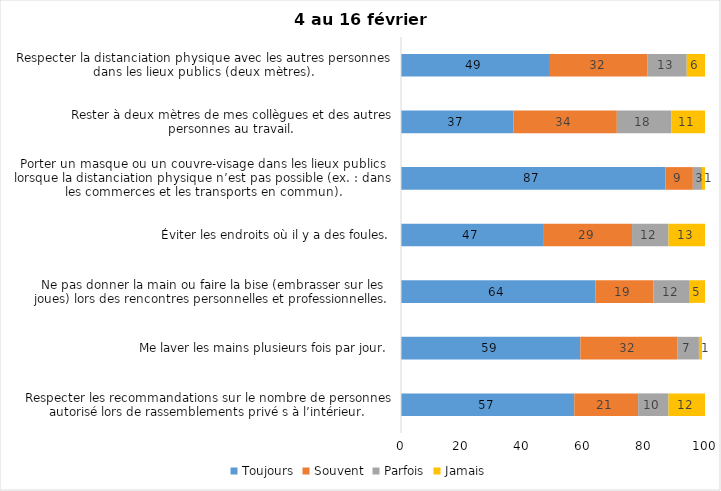
| Category | Toujours | Souvent | Parfois | Jamais |
|---|---|---|---|---|
| Respecter les recommandations sur le nombre de personnes autorisé lors de rassemblements privé s à l’intérieur. | 57 | 21 | 10 | 12 |
| Me laver les mains plusieurs fois par jour. | 59 | 32 | 7 | 1 |
| Ne pas donner la main ou faire la bise (embrasser sur les joues) lors des rencontres personnelles et professionnelles. | 64 | 19 | 12 | 5 |
| Éviter les endroits où il y a des foules. | 47 | 29 | 12 | 13 |
| Porter un masque ou un couvre-visage dans les lieux publics lorsque la distanciation physique n’est pas possible (ex. : dans les commerces et les transports en commun). | 87 | 9 | 3 | 1 |
| Rester à deux mètres de mes collègues et des autres personnes au travail. | 37 | 34 | 18 | 11 |
| Respecter la distanciation physique avec les autres personnes dans les lieux publics (deux mètres). | 49 | 32 | 13 | 6 |